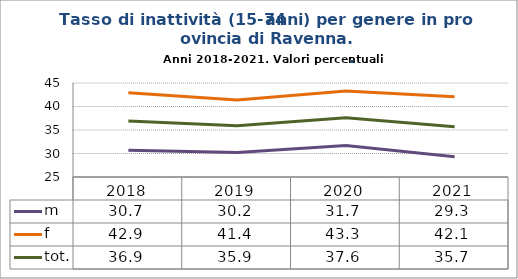
| Category | m | f | tot. |
|---|---|---|---|
| 2018.0 | 30.7 | 42.9 | 36.9 |
| 2019.0 | 30.2 | 41.4 | 35.9 |
| 2020.0 | 31.7 | 43.3 | 37.6 |
| 2021.0 | 29.3 | 42.1 | 35.7 |